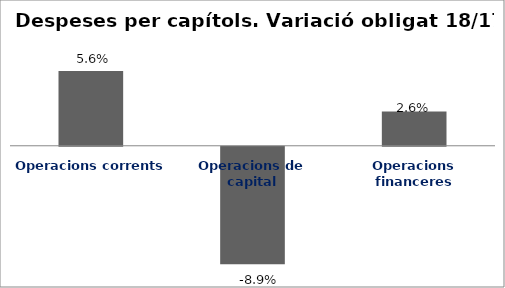
| Category | Series 0 |
|---|---|
| Operacions corrents | 0.056 |
| Operacions de capital | -0.089 |
| Operacions financeres | 0.026 |